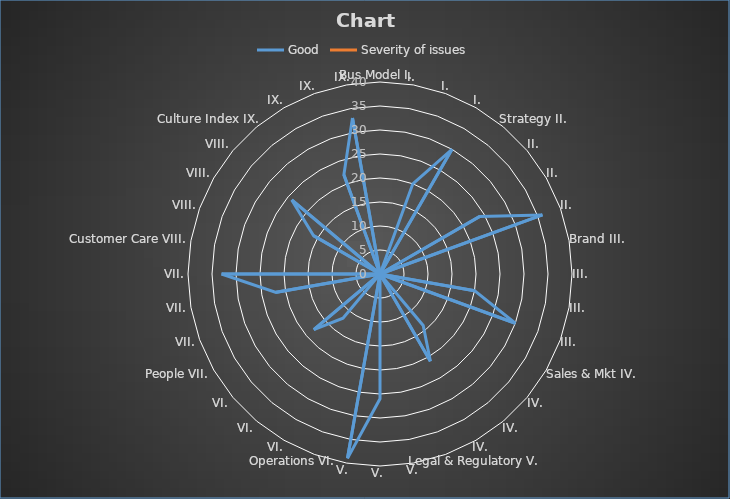
| Category | Good | Severity of issues |
|---|---|---|
| Bus Model I.  | 0 | 0 |
| I.  | 0 | 0 |
| I.  | 20 | 0 |
| I.  | 30 | 0 |
| Strategy II.  | 0 | 0 |
| II.  | 0 | 0 |
| II.  | 24 | 0 |
| II.  | 36 | 0 |
| Brand III.  | 0 | 0 |
| III.  | 0 | 0 |
| III.  | 20 | 0 |
| III.  | 30 | 0 |
| Sales & Mkt IV. | 0 | 0 |
| IV. | 0 | 0 |
| IV. | 14 | 0 |
| IV. | 21 | 0 |
| Legal & Regulatory V. | 0 | 0 |
| V. | 0 | 0 |
| V. | 26 | 0 |
| V. | 39 | 0 |
| Operations VI. | 0 | 0 |
| VI. | 0 | 0 |
| VI. | 12 | 0 |
| VI. | 18 | 0 |
| People VII. | 0 | 0 |
| VII. | 0 | 0 |
| VII. | 22 | 0 |
| VII. | 33 | 0 |
| Customer Care VIII. | 0 | 0 |
| VIII. | 0 | 0 |
| VIII. | 16 | 0 |
| VIII. | 24 | 0 |
| Culture Index IX. | 0 | 0 |
| IX. | 0 | 0 |
| IX. | 22 | 0 |
| IX. | 33 | 0 |